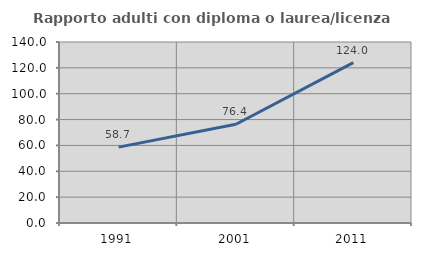
| Category | Rapporto adulti con diploma o laurea/licenza media  |
|---|---|
| 1991.0 | 58.678 |
| 2001.0 | 76.37 |
| 2011.0 | 124.016 |